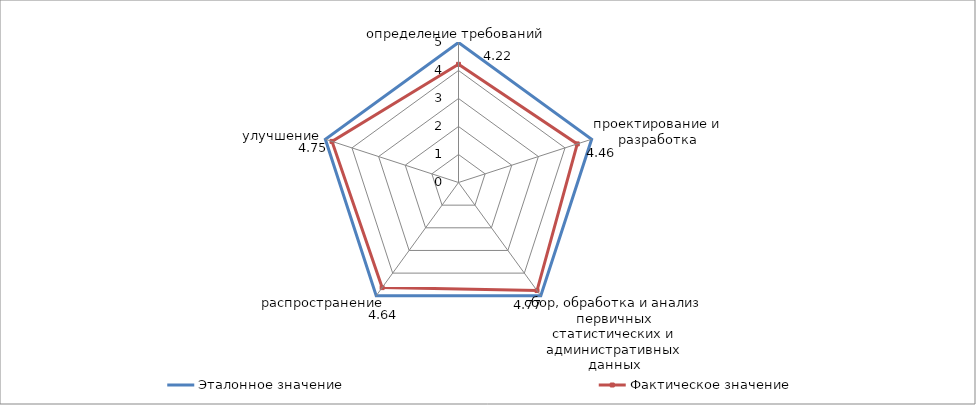
| Category | Эталонное значение | Фактическое значение |
|---|---|---|
| определение требований | 5 | 4.22 |
| проектирование и разработка | 5 | 4.46 |
| сбор, обработка и анализ первичных статистических и административных данных | 5 | 4.77 |
| распространение | 5 | 4.64 |
| улучшение | 5 | 4.75 |